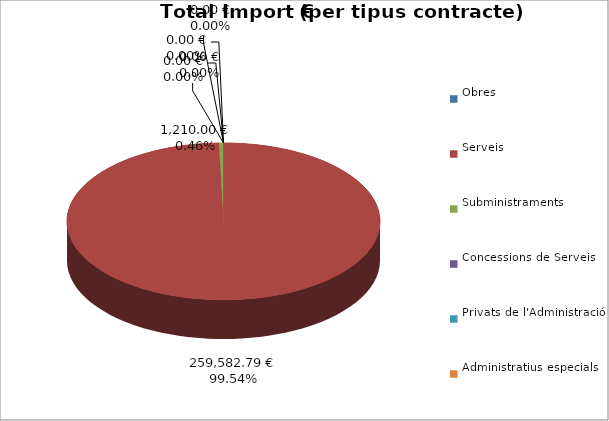
| Category | Total preu
(amb IVA) |
|---|---|
| Obres | 0 |
| Serveis | 259582.785 |
| Subministraments | 1210 |
| Concessions de Serveis | 0 |
| Privats de l'Administració | 0 |
| Administratius especials | 0 |